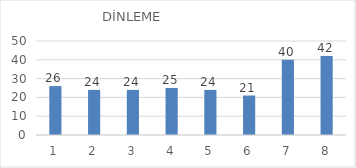
| Category | Series 0 |
|---|---|
| 0 | 26 |
| 1 | 24 |
| 2 | 24 |
| 3 | 25 |
| 4 | 24 |
| 5 | 21 |
| 6 | 40 |
| 7 | 42 |